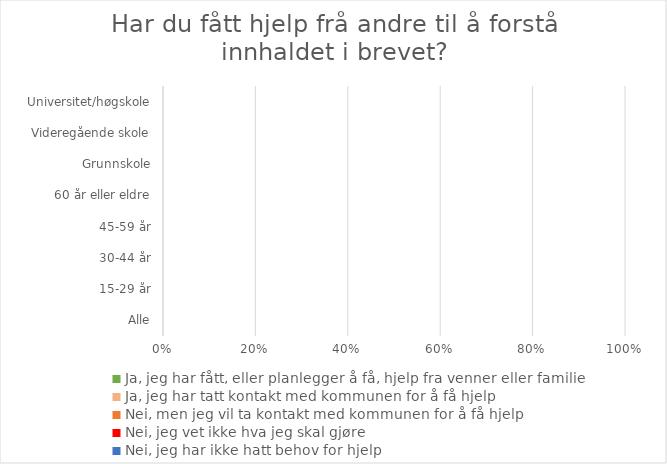
| Category | Ja, jeg har fått, eller planlegger å få, hjelp fra venner eller familie | Ja, jeg har tatt kontakt med kommunen for å få hjelp | Nei, men jeg vil ta kontakt med kommunen for å få hjelp | Nei, jeg vet ikke hva jeg skal gjøre | Nei, jeg har ikke hatt behov for hjelp |
|---|---|---|---|---|---|
| Alle | 0 | 0 | 0 | 0 | 0 |
| 15-29 år | 0 | 0 | 0 | 0 | 0 |
| 30-44 år | 0 | 0 | 0 | 0 | 0 |
| 45-59 år | 0 | 0 | 0 | 0 | 0 |
| 60 år eller eldre | 0 | 0 | 0 | 0 | 0 |
| Grunnskole | 0 | 0 | 0 | 0 | 0 |
| Videregående skole | 0 | 0 | 0 | 0 | 0 |
| Universitet/høgskole | 0 | 0 | 0 | 0 | 0 |